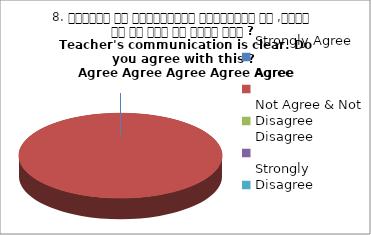
| Category | 8. शिक्षक का सम्प्रेषण सुस्पष्ठ है ,क्या आप इस बात से सहमत हैं ?
Teacher's communication is clear. Do you agree with this ? 
 Agree Agree Agree Agree Agree |
|---|---|
| Strongly Agree | 0 |
| Agree | 5 |
| Not Agree & Not Disagree | 0 |
| Disagree | 0 |
| Strongly Disagree | 0 |